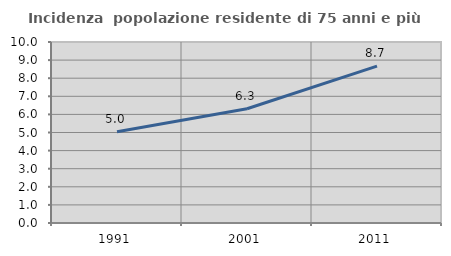
| Category | Incidenza  popolazione residente di 75 anni e più |
|---|---|
| 1991.0 | 5.037 |
| 2001.0 | 6.313 |
| 2011.0 | 8.666 |